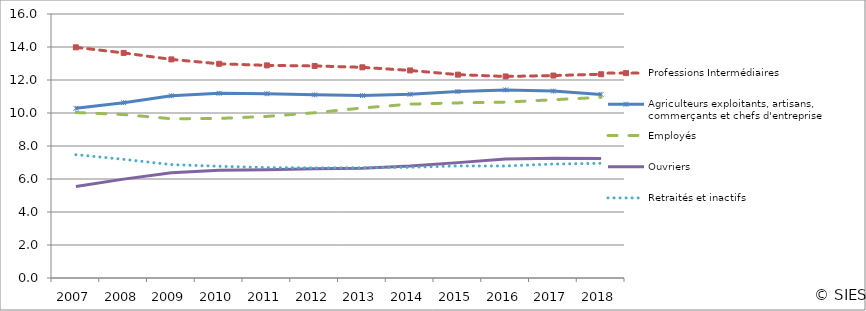
| Category | Professions Intermédiaires | Agriculteurs exploitants, artisans, commerçants et chefs d'entreprise | Employés | Ouvriers | Retraités et inactifs |
|---|---|---|---|---|---|
| 2007.0 | 13.98 | 10.283 | 10.03 | 5.552 | 7.475 |
| 2008.0 | 13.641 | 10.626 | 9.906 | 5.993 | 7.192 |
| 2009.0 | 13.248 | 11.044 | 9.653 | 6.384 | 6.872 |
| 2010.0 | 12.983 | 11.194 | 9.67 | 6.529 | 6.771 |
| 2011.0 | 12.886 | 11.17 | 9.795 | 6.562 | 6.695 |
| 2012.0 | 12.852 | 11.1 | 10.014 | 6.618 | 6.675 |
| 2013.0 | 12.769 | 11.056 | 10.305 | 6.654 | 6.685 |
| 2014.0 | 12.579 | 11.135 | 10.538 | 6.781 | 6.709 |
| 2015.0 | 12.325 | 11.302 | 10.612 | 6.992 | 6.793 |
| 2016.0 | 12.216 | 11.4 | 10.659 | 7.211 | 6.788 |
| 2017.0 | 12.271 | 11.326 | 10.804 | 7.264 | 6.906 |
| 2018.0 | 12.349 | 11.127 | 10.948 | 7.246 | 6.95 |